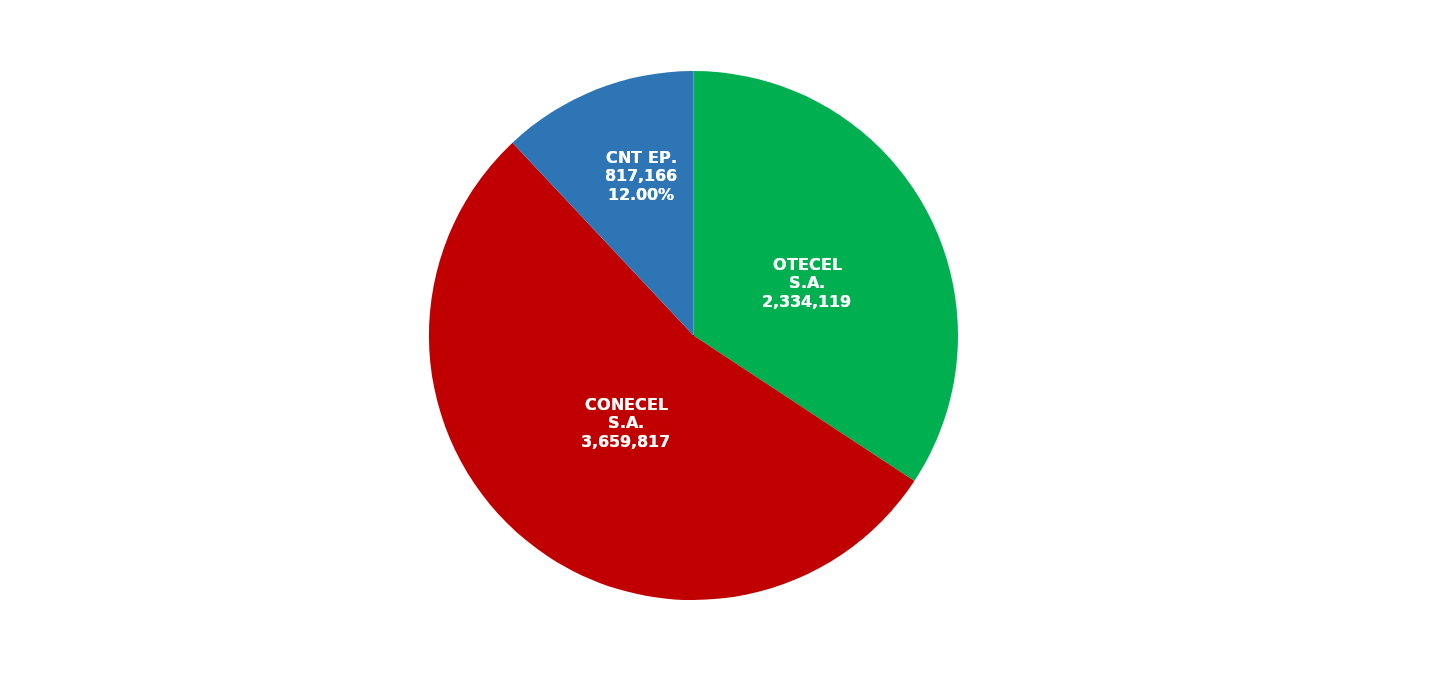
| Category | Series 0 |
|---|---|
| OTECEL S.A. | 2334119 |
| CONECEL S.A. | 3659817 |
| CNT EP. | 817166 |